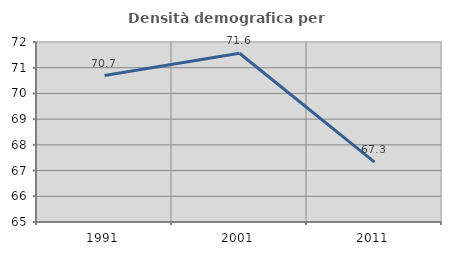
| Category | Densità demografica |
|---|---|
| 1991.0 | 70.694 |
| 2001.0 | 71.563 |
| 2011.0 | 67.328 |